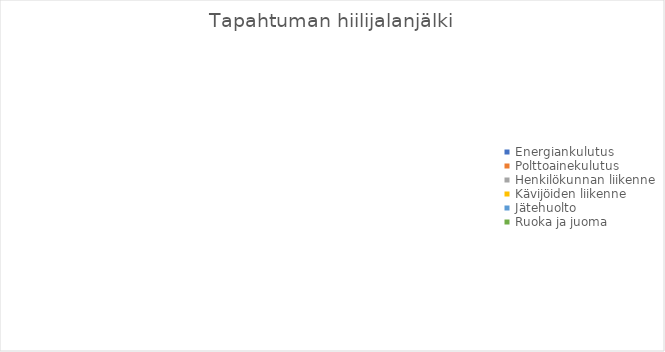
| Category | Series 1 |
|---|---|
| Energiankulutus | 0 |
| Polttoainekulutus | 0 |
| Henkilökunnan liikenne | 0 |
| Kävijöiden liikenne | 0 |
| Jätehuolto | 0 |
| Ruoka ja juoma | 0 |